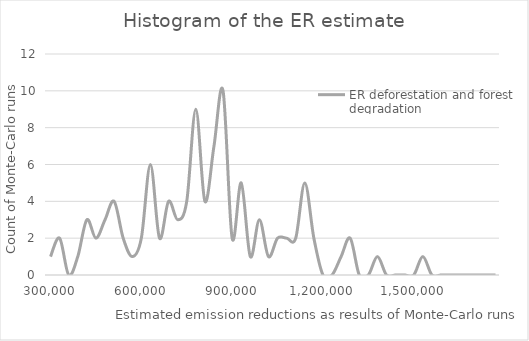
| Category | ER deforestation and forest degradation |
|---|---|
| 300000.0 | 1 |
| 330000.0 | 2 |
| 360000.0 | 0 |
| 390000.0 | 1 |
| 420000.0 | 3 |
| 450000.0 | 2 |
| 480000.0 | 3 |
| 510000.0 | 4 |
| 540000.0 | 2 |
| 570000.0 | 1 |
| 600000.0 | 2 |
| 630000.0 | 6 |
| 660000.0 | 2 |
| 690000.0 | 4 |
| 720000.0 | 3 |
| 750000.0 | 4 |
| 780000.0 | 9 |
| 810000.0 | 4 |
| 840000.0 | 7 |
| 870000.0 | 10 |
| 900000.0 | 2 |
| 930000.0 | 5 |
| 960000.0 | 1 |
| 990000.0 | 3 |
| 1020000.0 | 1 |
| 1050000.0 | 2 |
| 1080000.0 | 2 |
| 1110000.0 | 2 |
| 1140000.0 | 5 |
| 1170000.0 | 2 |
| 1200000.0 | 0 |
| 1230000.0 | 0 |
| 1260000.0 | 1 |
| 1290000.0 | 2 |
| 1320000.0 | 0 |
| 1350000.0 | 0 |
| 1380000.0 | 1 |
| 1410000.0 | 0 |
| 1440000.0 | 0 |
| 1470000.0 | 0 |
| 1500000.0 | 0 |
| 1530000.0 | 1 |
| 1560000.0 | 0 |
| 1590000.0 | 0 |
| 1620000.0 | 0 |
| 1650000.0 | 0 |
| 1680000.0 | 0 |
| 1710000.0 | 0 |
| 1740000.0 | 0 |
| 1770000.0 | 0 |